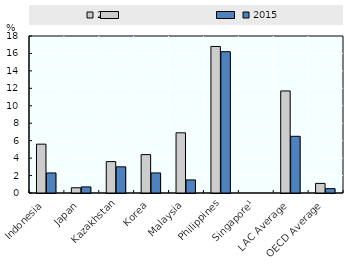
| Category | 2000 | 2015 |
|---|---|---|
| Indonesia | 5.6 | 2.3 |
| Japan | 0.6 | 0.7 |
| Kazakhstan | 3.6 | 3 |
| Korea | 4.4 | 2.3 |
| Malaysia | 6.9 | 1.5 |
| Philippines | 16.8 | 16.2 |
| Singapore¹ | 0 | 0 |
| LAC Average | 11.7 | 6.5 |
| OECD Average | 1.1 | 0.5 |